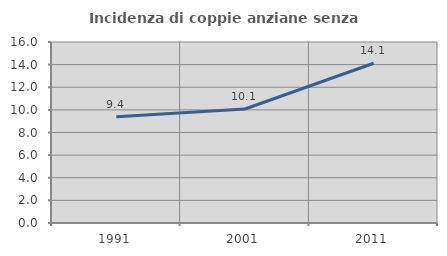
| Category | Incidenza di coppie anziane senza figli  |
|---|---|
| 1991.0 | 9.396 |
| 2001.0 | 10.076 |
| 2011.0 | 14.124 |